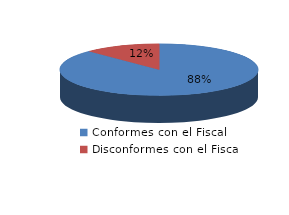
| Category | Series 0 |
|---|---|
| 0 | 629 |
| 1 | 89 |